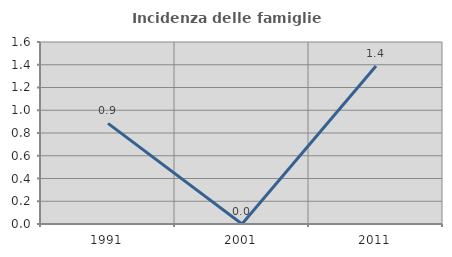
| Category | Incidenza delle famiglie numerose |
|---|---|
| 1991.0 | 0.885 |
| 2001.0 | 0 |
| 2011.0 | 1.389 |